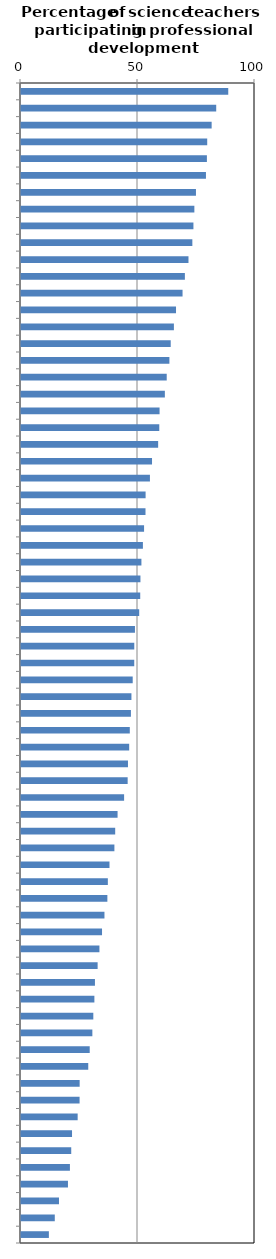
| Category | Series 0 |
|---|---|
| United States | 88.571 |
| Australia | 83.425 |
| Singapore | 81.471 |
| United Kingdom | 79.578 |
| New Zealand | 79.445 |
| United Arab Emirates | 79.04 |
| Qatar | 74.769 |
| Macao (China) | 74.086 |
| Canada | 73.687 |
| Sweden | 73.226 |
| Thailand | 71.574 |
| Iceland | 70.035 |
| B-S-J-G (China) | 69.039 |
| Korea | 66.247 |
| Chinese Taipei | 65.342 |
| Israel | 63.98 |
| Lithuania | 63.42 |
| Viet Nam | 62.275 |
| Poland | 61.48 |
| Estonia | 59.221 |
| Netherlands | 59.096 |
| Finland | 58.611 |
| Croatia | 55.992 |
| Romania | 55.098 |
| Hong Kong (China) | 53.248 |
| Brazil | 53.205 |
| Luxembourg | 52.594 |
| Belgium | 52.098 |
| OECD average | 51.459 |
| Latvia | 51.044 |
| Ireland | 50.952 |
| Tunisia | 50.513 |
| Bulgaria | 48.7 |
| Greece | 48.41 |
| Switzerland | 48.393 |
| Slovenia | 47.738 |
| Spain | 47.193 |
| Dominican Republic | 46.975 |
| Chile | 46.497 |
| Austria | 46.232 |
| Montenegro | 45.716 |
| Lebanon | 45.581 |
| Peru | 44.063 |
| Germany | 41.27 |
| Costa Rica | 40.256 |
| Denmark | 39.915 |
| Czech Republic | 37.819 |
| Portugal | 37.114 |
| Colombia | 36.91 |
| Slovak Republic | 35.666 |
| Japan | 34.628 |
| Malta | 33.517 |
| Trinidad and Tobago | 32.747 |
| France | 31.602 |
| Italy | 31.36 |
| Mexico | 30.904 |
| Russia | 30.495 |
| CABA (Argentina) | 29.366 |
| Hungary | 28.742 |
| Moldova | 25.068 |
| Algeria | 25.036 |
| Norway | 24.214 |
| Jordan | 21.807 |
| Uruguay | 21.467 |
| Indonesia | 20.905 |
| Turkey | 20.07 |
| Kosovo | 16.233 |
| Georgia | 14.441 |
| FYROM | 11.912 |